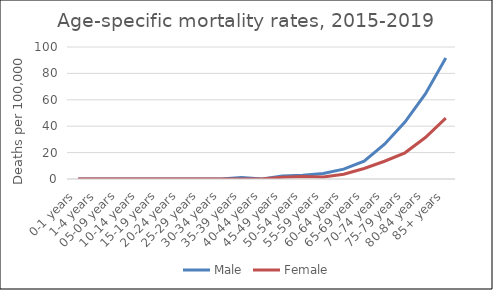
| Category | Male | Female |
|---|---|---|
| 0-1 years | 0 | 0 |
| 1-4 years | 0 | 0 |
| 05-09 years | 0 | 0 |
| 10-14 years | 0 | 0 |
| 15-19 years | 0 | 0 |
| 20-24 years | 0 | 0 |
| 25-29 years | 0 | 0 |
| 30-34 years | 0 | 0 |
| 35-39 years | 1.14 | 0 |
| 40-44 years | 0 | 0 |
| 45-49 years | 2.32 | 1.26 |
| 50-54 years | 2.87 | 1.86 |
| 55-59 years | 4.25 | 1.48 |
| 60-64 years | 7.44 | 3.55 |
| 65-69 years | 13.51 | 7.97 |
| 70-74 years | 26.35 | 13.44 |
| 75-79 years | 43.15 | 19.84 |
| 80-84 years | 64.47 | 31.4 |
| 85+ years | 91.61 | 46.1 |